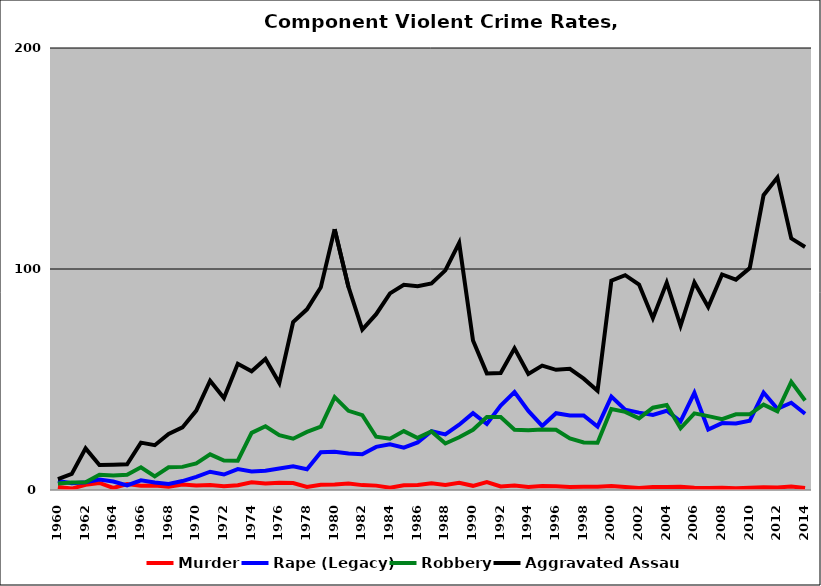
| Category | Murder | Rape (Legacy) | Robbery | Aggravated Assault |
|---|---|---|---|---|
| 1960.0 | 1.318 | 4.119 | 2.966 | 4.943 |
| 1961.0 | 0.644 | 3.06 | 3.382 | 7.246 |
| 1962.0 | 2.373 | 3.481 | 3.481 | 18.829 |
| 1963.0 | 3.19 | 4.785 | 6.858 | 11.324 |
| 1964.0 | 0.917 | 3.823 | 6.575 | 11.468 |
| 1965.0 | 2.691 | 2.093 | 6.876 | 11.659 |
| 1966.0 | 1.909 | 4.405 | 10.279 | 21.439 |
| 1967.0 | 2.041 | 3.353 | 6.122 | 20.262 |
| 1968.0 | 1.425 | 2.707 | 10.256 | 25.356 |
| 1969.0 | 2.51 | 4.045 | 10.46 | 28.312 |
| 1970.0 | 2.033 | 5.965 | 12.065 | 35.923 |
| 1971.0 | 2.231 | 8.268 | 16.142 | 49.475 |
| 1972.0 | 1.686 | 7.004 | 13.359 | 41.634 |
| 1973.0 | 2.149 | 9.482 | 13.274 | 57.143 |
| 1974.0 | 3.465 | 8.416 | 25.866 | 53.713 |
| 1975.0 | 2.934 | 8.68 | 28.851 | 59.291 |
| 1976.0 | 3.285 | 9.732 | 24.818 | 48.418 |
| 1977.0 | 3.18 | 10.718 | 23.204 | 75.972 |
| 1978.0 | 1.378 | 9.414 | 26.292 | 81.745 |
| 1979.0 | 2.368 | 17.136 | 28.636 | 91.77 |
| 1980.0 | 2.502 | 17.299 | 41.997 | 118.048 |
| 1981.0 | 2.888 | 16.471 | 35.829 | 91.872 |
| 1982.0 | 2.208 | 16.193 | 33.859 | 72.555 |
| 1983.0 | 1.981 | 19.499 | 24.088 | 79.562 |
| 1984.0 | 1.024 | 20.676 | 23.234 | 88.946 |
| 1985.0 | 2.104 | 19.138 | 26.653 | 92.886 |
| 1986.0 | 2.24 | 21.519 | 23.564 | 92.21 |
| 1987.0 | 3.027 | 26.585 | 26.49 | 93.472 |
| 1988.0 | 2.279 | 25.16 | 21.057 | 99.362 |
| 1989.0 | 3.252 | 29.539 | 23.848 | 111.834 |
| 1990.0 | 1.893 | 34.798 | 27.226 | 67.613 |
| 1991.0 | 3.62 | 29.864 | 33.032 | 52.76 |
| 1992.0 | 1.62 | 38.164 | 33.033 | 52.925 |
| 1993.0 | 2.044 | 44.356 | 27.289 | 64.089 |
| 1994.0 | 1.407 | 35.796 | 27.089 | 52.507 |
| 1995.0 | 1.829 | 29.007 | 27.352 | 56.272 |
| 1996.0 | 1.721 | 34.768 | 27.281 | 54.389 |
| 1997.0 | 1.364 | 33.674 | 23.359 | 54.817 |
| 1998.0 | 1.519 | 33.755 | 21.519 | 50.38 |
| 1999.0 | 1.499 | 28.723 | 21.396 | 44.874 |
| 2000.0 | 1.78 | 42.24 | 36.657 | 94.677 |
| 2001.0 | 1.35 | 36.368 | 35.335 | 97.192 |
| 2002.0 | 0.942 | 34.997 | 32.407 | 92.985 |
| 2003.0 | 1.319 | 33.988 | 37.247 | 77.752 |
| 2004.0 | 1.309 | 35.869 | 38.486 | 93.829 |
| 2005.0 | 1.454 | 31.068 | 27.93 | 74.303 |
| 2006.0 | 0.989 | 43.958 | 34.68 | 93.924 |
| 2007.0 | 0.912 | 27.359 | 33.439 | 82.838 |
| 2008.0 | 1.059 | 30.26 | 32.076 | 97.513 |
| 2009.0 | 0.83 | 30.123 | 34.275 | 95.2 |
| 2010.0 | 0.987 | 31.296 | 34.258 | 100.42 |
| 2011.0 | 1.214 | 44.088 | 38.625 | 133.403 |
| 2012.0 | 1.135 | 36.773 | 35.638 | 141.418 |
| 2013.0 | 1.588 | 39.467 | 48.918 | 113.865 |
| 2014.0 | 0.904 | 34.519 | 40.473 | 109.963 |